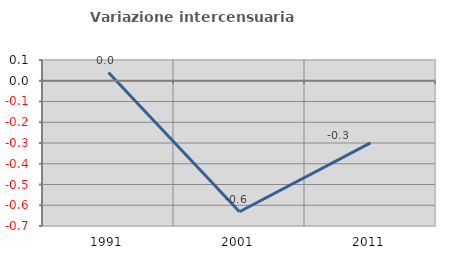
| Category | Variazione intercensuaria annua |
|---|---|
| 1991.0 | 0.04 |
| 2001.0 | -0.632 |
| 2011.0 | -0.299 |